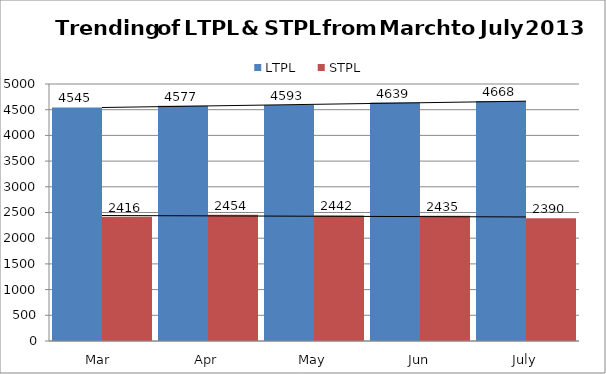
| Category | LTPL | STPL |
|---|---|---|
| Mar  | 4545 | 2416 |
| Apr | 4577 | 2454 |
| May | 4593 | 2442 |
| Jun | 4639 | 2435 |
| July | 4668 | 2390 |